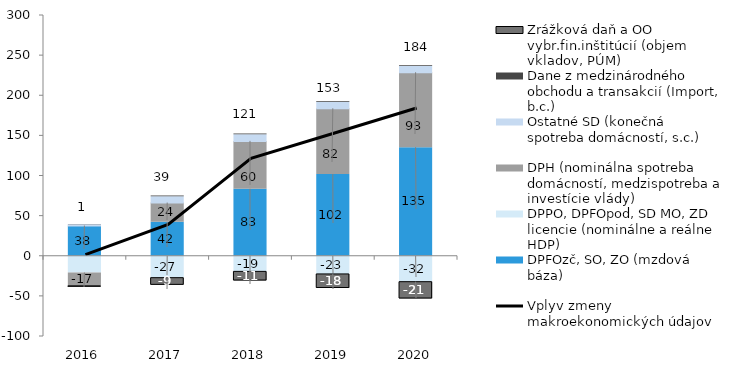
| Category | DPFOzč, SO, ZO (mzdová báza) | DPPO, DPFOpod, SD MO, ZD licencie (nominálne a reálne HDP) | DPH (nominálna spotreba domácností, medzispotreba a investície vlády) | Ostatné SD (konečná spotreba domácností, s.c.) | Dane z medzinárodného obchodu a transakcií (Import, b.c.) | Zrážková daň a OO vybr.fin.inštitúcií (objem vkladov, PÚM) |
|---|---|---|---|---|---|---|
| 2016.0 | 37.651 | -20.948 | -17.082 | 1.624 | 0.321 | -0.227 |
| 2017.0 | 42.28 | -27.304 | 23.998 | 8.004 | 0.9 | -8.978 |
| 2018.0 | 83.492 | -19.488 | 59.637 | 8.193 | 0.999 | -11.406 |
| 2019.0 | 101.795 | -22.651 | 81.94 | 8.124 | 1.012 | -17.536 |
| 2020.0 | 135.265 | -32.318 | 93.393 | 7.833 | 0.97 | -20.974 |